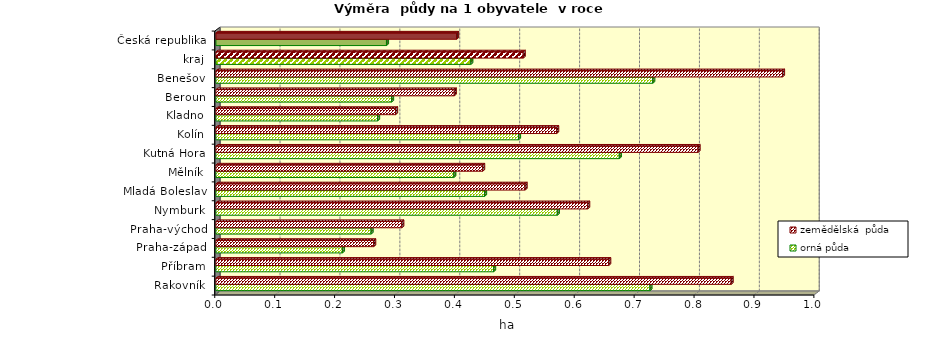
| Category | orná půda | zemědělská  půda |
|---|---|---|
| Rakovník | 0.724 | 0.86 |
| Příbram | 0.463 | 0.656 |
| Praha-západ | 0.211 | 0.263 |
| Praha-východ | 0.259 | 0.31 |
| Nymburk | 0.57 | 0.62 |
| Mladá Boleslav | 0.448 | 0.516 |
| Mělník | 0.397 | 0.445 |
| Kutná Hora | 0.673 | 0.805 |
| Kolín | 0.505 | 0.569 |
| Kladno | 0.27 | 0.3 |
| Beroun | 0.293 | 0.398 |
| Benešov | 0.729 | 0.946 |
| kraj | 0.425 | 0.513 |
| Česká republika | 0.285 | 0.402 |